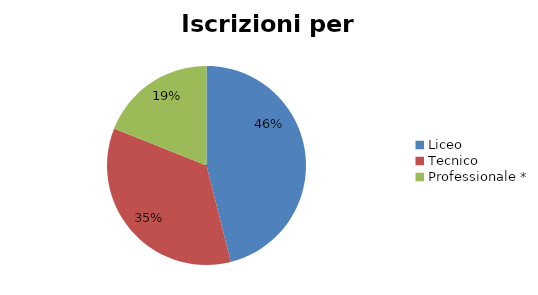
| Category | Series 0 |
|---|---|
| Liceo  | 17970 |
| Tecnico | 13644 |
| Professionale * | 7394 |